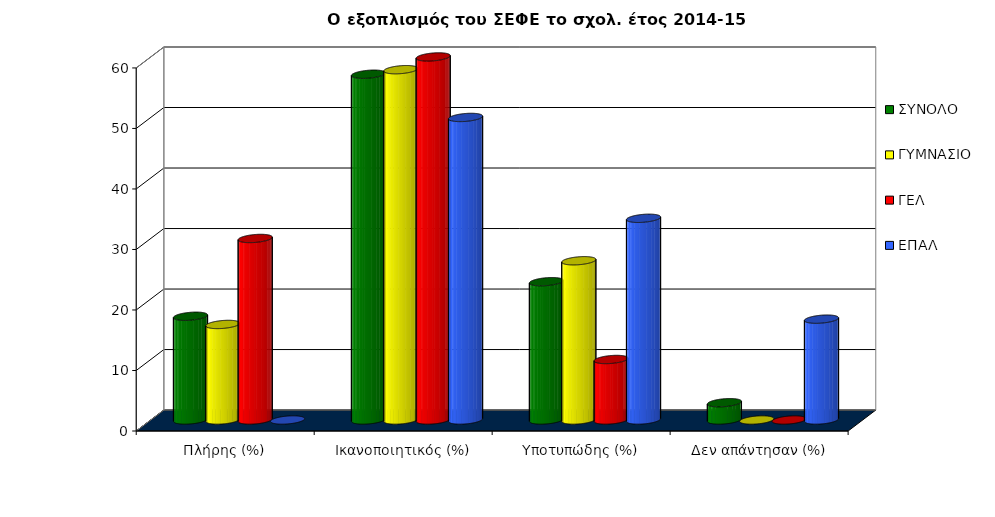
| Category | ΣΥΝΟΛΟ | ΓΥΜΝΑΣΙΟ | ΓΕΛ | ΕΠΑΛ |
|---|---|---|---|---|
| Πλήρης (%) | 17.143 | 15.789 | 30 | 0 |
| Ικανοποιητικός (%) | 57.143 | 57.895 | 60 | 50 |
| Υποτυπώδης (%) | 22.857 | 26.316 | 10 | 33.333 |
| Δεν απάντησαν (%) | 2.857 | 0 | 0 | 16.667 |